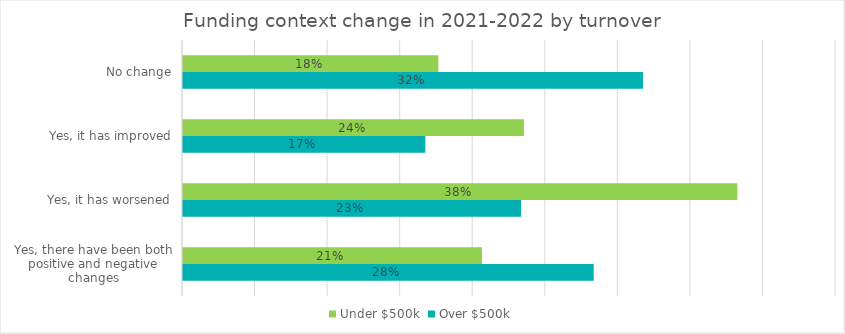
| Category | Under $500k | Over $500k |
|---|---|---|
| No change | 17.6 | 31.7 |
| Yes, it has improved | 23.5 | 16.7 |
| Yes, it has worsened | 38.2 | 23.3 |
| Yes, there have been both positive and negative changes | 20.6 | 28.3 |